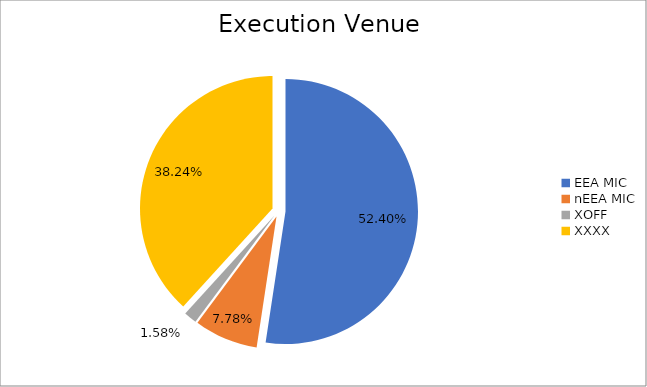
| Category | Series 0 |
|---|---|
| EEA MIC | 5984436.966 |
| nEEA MIC | 888550.552 |
| XOFF | 180970.919 |
| XXXX | 4367065.71 |